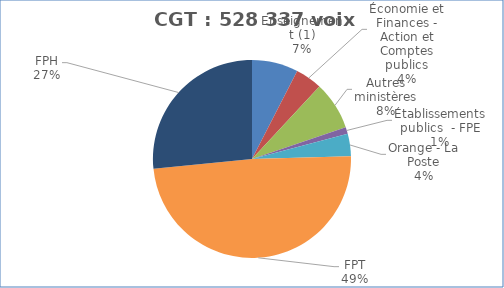
| Category | Nombre de voix |
|---|---|
| Enseignement (1) | 39877 |
| Économie et Finances - Action et Comptes publics | 23053.9 |
| Autres ministères | 41635.7 |
| Établissements publics  - FPE | 5853 |
| Orange - La Poste | 19388 |
| FPT | 258119 |
| FPH | 140410.5 |